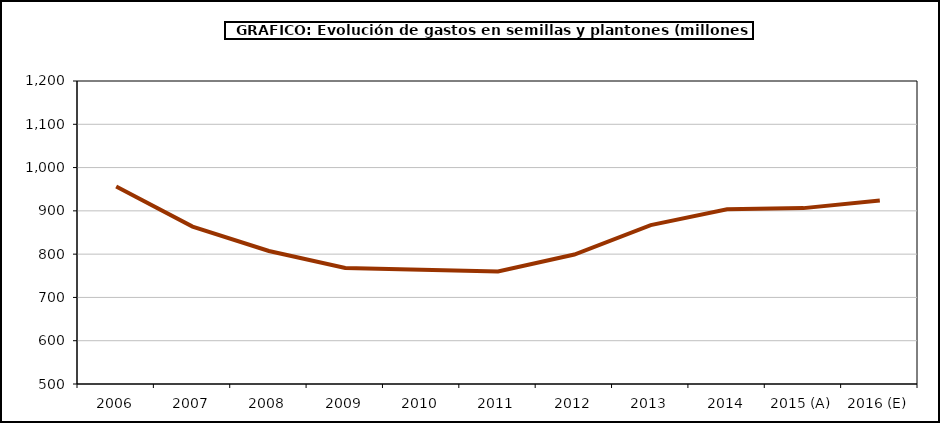
| Category | Semillas |
|---|---|
| 2006 | 956.313 |
| 2007 | 863.62 |
| 2008 | 807.244 |
| 2009 | 768.186 |
| 2010 | 763.963 |
| 2011 | 759.736 |
| 2012 | 799.053 |
| 2013 | 867.097 |
| 2014 | 903.589 |
| 2015 (A) | 906.331 |
| 2016 (E) | 923.979 |